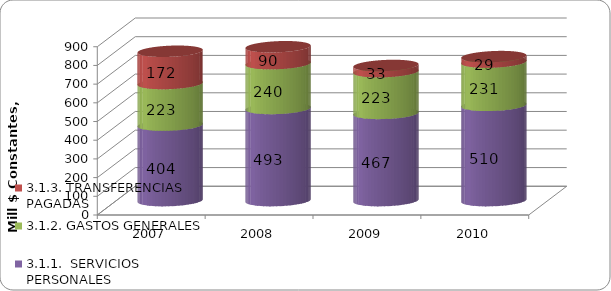
| Category | 3.1.1.  SERVICIOS PERSONALES | 3.1.2. GASTOS GENERALES | 3.1.3. TRANSFERENCIAS PAGADAS |
|---|---|---|---|
| 2007 | 404.063 | 222.545 | 172.365 |
| 2008 | 493.15 | 239.814 | 90.189 |
| 2009 | 466.661 | 223.453 | 32.798 |
| 2010 | 509.874 | 231.449 | 29.067 |